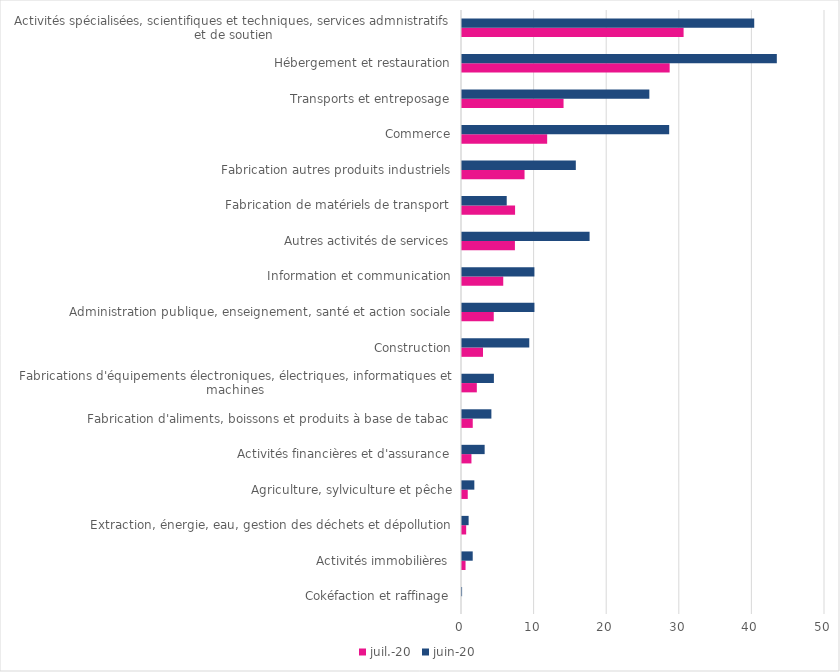
| Category | juil.-20 | juin-20 |
|---|---|---|
| Cokéfaction et raffinage | 0 | 0.012 |
| Activités immobilières | 0.488 | 1.476 |
| Extraction, énergie, eau, gestion des déchets et dépollution | 0.575 | 0.912 |
| Agriculture, sylviculture et pêche | 0.791 | 1.699 |
| Activités financières et d'assurance | 1.301 | 3.12 |
| Fabrication d'aliments, boissons et produits à base de tabac | 1.48 | 4.047 |
| Fabrications d'équipements électroniques, électriques, informatiques et machines | 2.042 | 4.393 |
| Construction | 2.891 | 9.265 |
| Administration publique, enseignement, santé et action sociale | 4.374 | 9.977 |
| Information et communication | 5.681 | 9.974 |
| Autres activités de services | 7.289 | 17.574 |
| Fabrication de matériels de transport | 7.31 | 6.161 |
| Fabrication autres produits industriels | 8.615 | 15.677 |
| Commerce | 11.731 | 28.538 |
| Transports et entreposage | 13.988 | 25.805 |
| Hébergement et restauration | 28.604 | 43.364 |
| Activités spécialisées, scientifiques et techniques, services admnistratifs et de soutien | 30.523 | 40.252 |